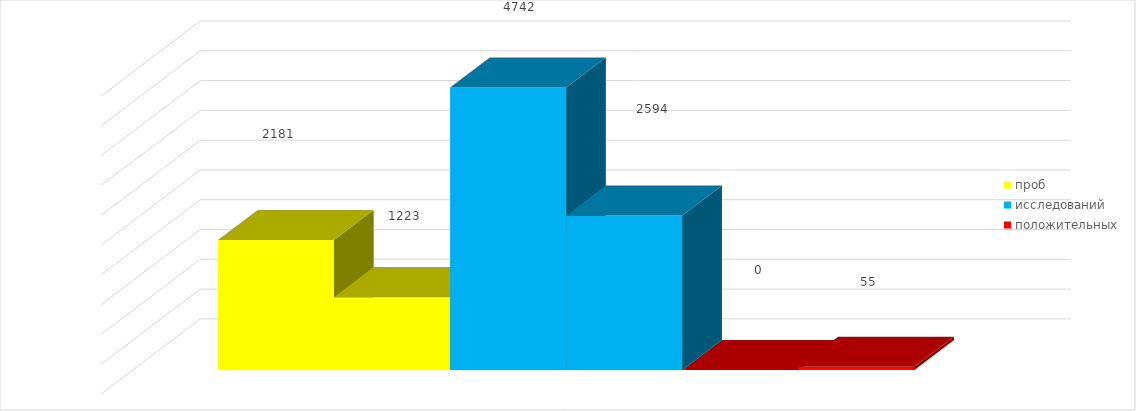
| Category | проб | 1 квартал 2021 год | исследований | положительных |
|---|---|---|---|---|
| 1 квартал 2020 год | 2181 | 1223 | 2594 | 55 |